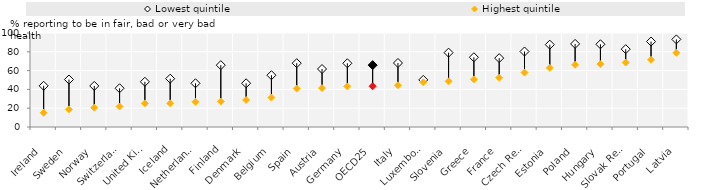
| Category | Lowest quintile | Highest quintile |
|---|---|---|
| Ireland | 43.8 | 15.1 |
| Sweden | 50.5 | 18.7 |
| Norway | 43.7 | 20.5 |
| Switzerland | 41.2 | 21.8 |
| United Kingdom | 48.1 | 25.1 |
| Iceland | 51.4 | 25.2 |
| Netherlands | 46.5 | 26.8 |
| Finland | 65.8 | 27.1 |
| Denmark | 46.5 | 28.7 |
| Belgium | 55.1 | 31.3 |
| Spain | 67.9 | 40.9 |
| Austria | 61.7 | 41.4 |
| Germany  | 67.8 | 43.2 |
| OECD25 | 65.84 | 43.288 |
| Italy | 68.1 | 44.4 |
| Luxembourg | 50.1 | 47.6 |
| Slovenia | 79.1 | 48.6 |
| Greece | 74.2 | 50.6 |
| France | 73.3 | 52.4 |
| Czech Republic | 80.3 | 57.9 |
| Estonia | 87.6 | 62.9 |
| Poland | 88.4 | 66.1 |
| Hungary | 88 | 66.9 |
| Slovak Republic | 82.8 | 68.6 |
| Portugal | 90.9 | 71.5 |
| Latvia | 93.2 | 78.9 |